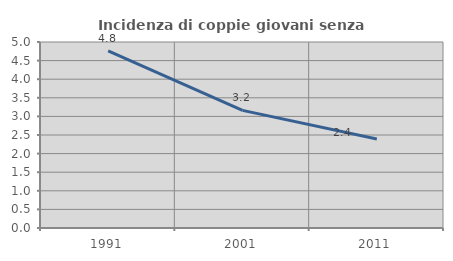
| Category | Incidenza di coppie giovani senza figli |
|---|---|
| 1991.0 | 4.762 |
| 2001.0 | 3.162 |
| 2011.0 | 2.39 |